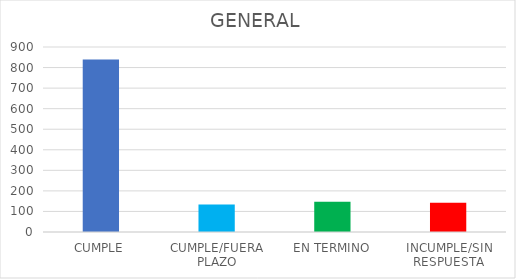
| Category | TOTAL |
|---|---|
| CUMPLE | 839 |
| CUMPLE/FUERA PLAZO | 134 |
| EN TERMINO | 147 |
| INCUMPLE/SIN RESPUESTA | 142 |